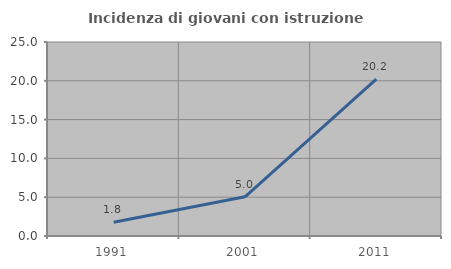
| Category | Incidenza di giovani con istruzione universitaria |
|---|---|
| 1991.0 | 1.765 |
| 2001.0 | 5.046 |
| 2011.0 | 20.202 |